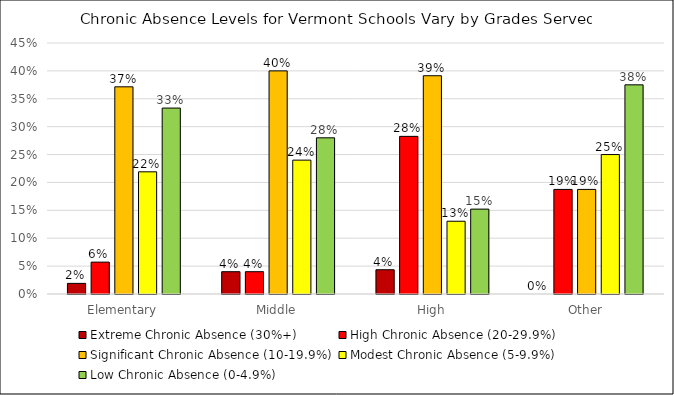
| Category | Extreme Chronic Absence (30%+) | High Chronic Absence (20-29.9%) | Significant Chronic Absence (10-19.9%) | Modest Chronic Absence (5-9.9%) | Low Chronic Absence (0-4.9%) |
|---|---|---|---|---|---|
| Elementary | 0.019 | 0.057 | 0.371 | 0.219 | 0.333 |
| Middle | 0.04 | 0.04 | 0.4 | 0.24 | 0.28 |
| High | 0.043 | 0.283 | 0.391 | 0.13 | 0.152 |
| Other | 0 | 0.188 | 0.188 | 0.25 | 0.375 |